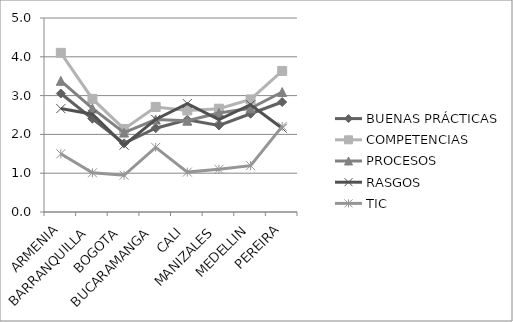
| Category | BUENAS PRÁCTICAS | COMPETENCIAS | PROCESOS | RASGOS | TIC |
|---|---|---|---|---|---|
| ARMENIA | 3.053 | 4.102 | 3.381 | 2.665 | 1.5 |
| BARRANQUILLA | 2.404 | 2.915 | 2.67 | 2.519 | 1.011 |
| BOGOTA | 1.769 | 2.14 | 2.046 | 1.723 | 0.947 |
| BUCARAMANGA | 2.16 | 2.707 | 2.381 | 2.387 | 1.667 |
| CALI | 2.377 | 2.617 | 2.352 | 2.794 | 1.029 |
| MANIZALES | 2.231 | 2.662 | 2.554 | 2.382 | 1.101 |
| MEDELLIN | 2.532 | 2.902 | 2.672 | 2.766 | 1.195 |
| PEREIRA | 2.834 | 3.634 | 3.092 | 2.159 | 2.207 |